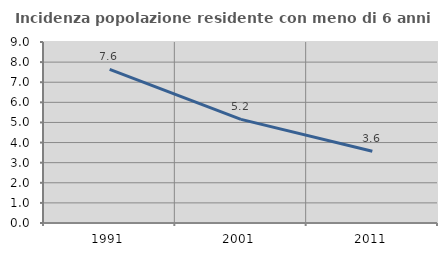
| Category | Incidenza popolazione residente con meno di 6 anni |
|---|---|
| 1991.0 | 7.639 |
| 2001.0 | 5.153 |
| 2011.0 | 3.565 |